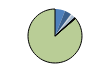
| Category | Series 0 |
|---|---|
| ARRASTRE | 56 |
| CERCO | 36 |
| ATUNEROS CAÑEROS | 2 |
| PALANGRE DE FONDO | 7 |
| PALANGRE DE SUPERFICIE | 20 |
| RASCO | 0 |
| VOLANTA | 2 |
| ARTES FIJAS | 4 |
| ARTES MENORES | 796 |